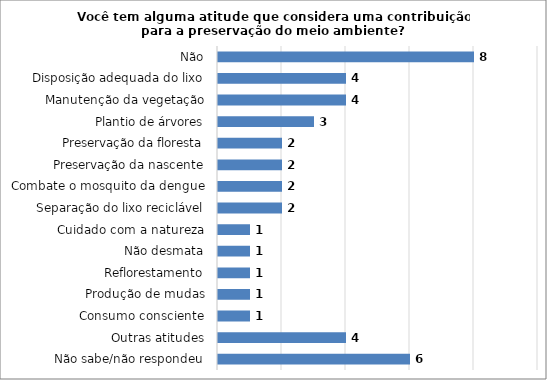
| Category | Series 0 |
|---|---|
| Não sabe/não respondeu | 6 |
| Outras atitudes | 4 |
| Consumo consciente | 1 |
| Produção de mudas | 1 |
| Reflorestamento | 1 |
| Não desmata | 1 |
| Cuidado com a natureza | 1 |
| Separação do lixo reciclável | 2 |
| Combate o mosquito da dengue | 2 |
| Preservação da nascente | 2 |
| Preservação da floresta | 2 |
| Plantio de árvores | 3 |
| Manutenção da vegetação | 4 |
| Disposição adequada do lixo | 4 |
| Não | 8 |